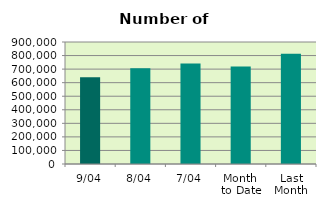
| Category | Series 0 |
|---|---|
| 9/04 | 639972 |
| 8/04 | 707206 |
| 7/04 | 740766 |
| Month 
to Date | 720059.2 |
| Last
Month | 813408 |